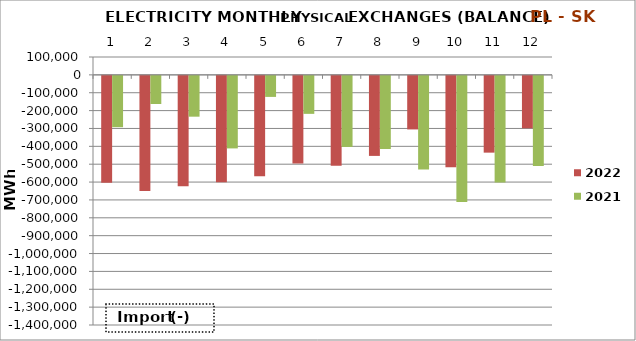
| Category | 2022 | 2021 |
|---|---|---|
| 0 | -597977.6 | -287338 |
| 1 | -644520.9 | -157547.7 |
| 2 | -618262.3 | -228441.9 |
| 3 | -595868.9 | -406042.2 |
| 4 | -562136.2 | -117752.6 |
| 5 | -489812.2 | -212627.3 |
| 6 | -502689.6 | -397826.2 |
| 7 | -447989.1 | -409369 |
| 8 | -299789.3 | -524163.2 |
| 9 | -511613.4 | -706343.1 |
| 10 | -429710.4 | -597388.5 |
| 11 | -293451.9 | -504089.8 |